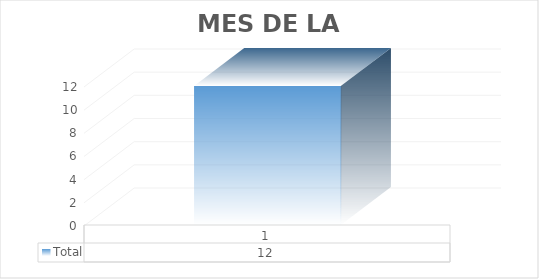
| Category | Total |
|---|---|
| 1 | 12 |